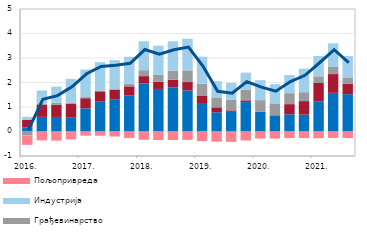
| Category | Остале делатности | Трговина | Грађевинарство | Индустрија | Пољопривреда |
|---|---|---|---|---|---|
| 2016. | 0.163 | 0.321 | -0.156 | 0.113 | -0.39 |
| II | 0.595 | 0.508 | 0.015 | 0.558 | -0.363 |
| III | 0.594 | 0.494 | 0.088 | 0.66 | -0.372 |
| IV | 0.585 | 0.553 | 0.046 | 0.96 | -0.322 |
| 2017. | 0.945 | 0.413 | 0.049 | 1.121 | -0.172 |
| II | 1.216 | 0.424 | 0.032 | 1.158 | -0.174 |
| III | 1.297 | 0.414 | 0.02 | 1.182 | -0.205 |
| IV | 1.478 | 0.366 | 0.113 | 1.094 | -0.268 |
| 2018. | 1.962 | 0.298 | 0.242 | 1.18 | -0.338 |
| II | 1.736 | 0.292 | 0.281 | 1.193 | -0.346 |
| III | 1.803 | 0.311 | 0.372 | 1.197 | -0.349 |
| IV | 1.675 | 0.344 | 0.476 | 1.293 | -0.341 |
| 2019. | 1.127 | 0.345 | 0.485 | 1.097 | -0.39 |
| II | 0.785 | 0.202 | 0.402 | 0.668 | -0.414 |
| III | 0.834 | 0.029 | 0.43 | 0.691 | -0.42 |
| IV | 1.2 | 0.072 | 0.444 | 0.687 | -0.366 |
| 2020. | 0.799 | 0.004 | 0.477 | 0.817 | -0.286 |
| II | 0.64 | 0.023 | 0.486 | 0.781 | -0.286 |
| III | 0.703 | 0.414 | 0.446 | 0.741 | -0.267 |
| IV | 0.688 | 0.553 | 0.363 | 0.959 | -0.27 |
| 2021. | 1.237 | 0.743 | 0.271 | 0.829 | -0.274 |
| II | 1.579 | 0.765 | 0.312 | 0.943 | -0.261 |
| III | 1.522 | 0.434 | 0.254 | 0.869 | -0.266 |